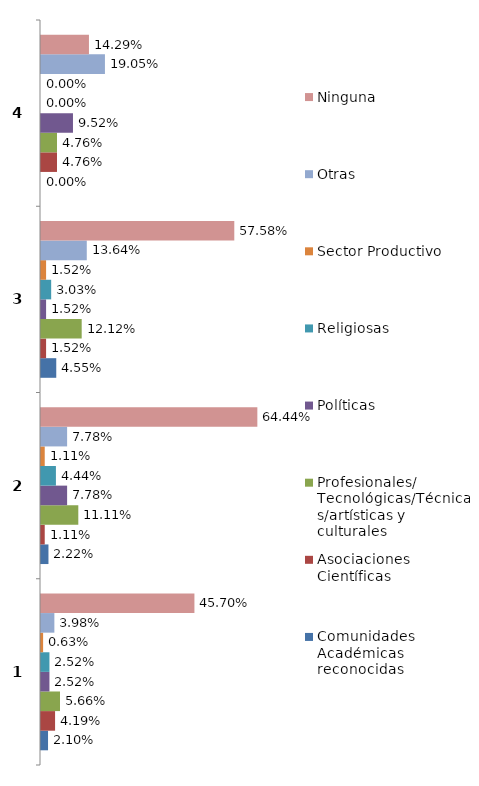
| Category | Comunidades Académicas reconocidas | Asociaciones Científicas | Profesionales/ Tecnológicas/Técnicas/artísticas y culturales | Políticas | Religiosas | Sector Productivo | Otras | Ninguna |
|---|---|---|---|---|---|---|---|---|
| 0 | 0.021 | 0.042 | 0.057 | 0.025 | 0.025 | 0.006 | 0.04 | 0.457 |
| 1 | 0.022 | 0.011 | 0.111 | 0.078 | 0.044 | 0.011 | 0.078 | 0.644 |
| 2 | 0.045 | 0.015 | 0.121 | 0.015 | 0.03 | 0.015 | 0.136 | 0.576 |
| 3 | 0 | 0.048 | 0.048 | 0.095 | 0 | 0 | 0.19 | 0.143 |